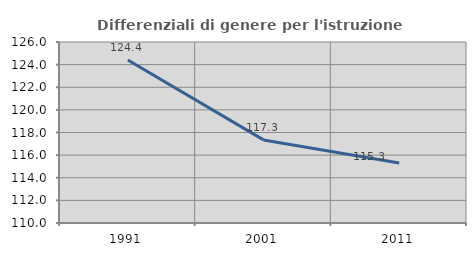
| Category | Differenziali di genere per l'istruzione superiore |
|---|---|
| 1991.0 | 124.414 |
| 2001.0 | 117.345 |
| 2011.0 | 115.299 |